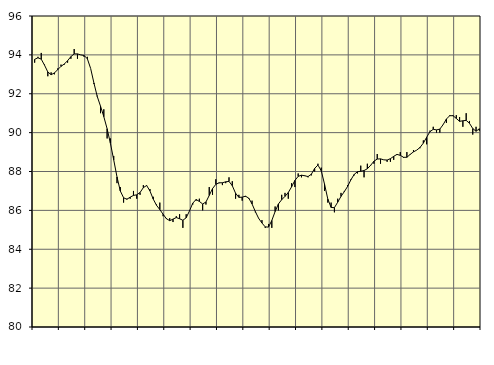
| Category | Piggar | Series 1 |
|---|---|---|
| nan | 93.6 | 93.77 |
| 87.0 | 93.9 | 93.85 |
| 87.0 | 94.1 | 93.78 |
| 87.0 | 93.5 | 93.47 |
| nan | 92.9 | 93.12 |
| 88.0 | 93.1 | 92.98 |
| 88.0 | 93 | 93.07 |
| 88.0 | 93.3 | 93.24 |
| nan | 93.5 | 93.41 |
| 89.0 | 93.5 | 93.53 |
| 89.0 | 93.6 | 93.7 |
| 89.0 | 93.8 | 93.91 |
| nan | 94.3 | 94.05 |
| 90.0 | 93.8 | 94.05 |
| 90.0 | 94 | 94 |
| 90.0 | 93.9 | 93.97 |
| nan | 93.9 | 93.8 |
| 91.0 | 93.3 | 93.3 |
| 91.0 | 92.5 | 92.55 |
| 91.0 | 91.9 | 91.86 |
| nan | 91 | 91.36 |
| 92.0 | 91.2 | 90.82 |
| 92.0 | 89.7 | 90.2 |
| 92.0 | 89.7 | 89.45 |
| nan | 88.8 | 88.6 |
| 93.0 | 87.4 | 87.72 |
| 93.0 | 87.2 | 87 |
| 93.0 | 86.4 | 86.65 |
| nan | 86.6 | 86.57 |
| 94.0 | 86.6 | 86.68 |
| 94.0 | 87 | 86.77 |
| 94.0 | 86.6 | 86.8 |
| nan | 86.8 | 86.92 |
| 95.0 | 87.3 | 87.17 |
| 95.0 | 87.3 | 87.28 |
| 95.0 | 87.1 | 87 |
| nan | 86.7 | 86.58 |
| 96.0 | 86.3 | 86.26 |
| 96.0 | 86.4 | 86.04 |
| 96.0 | 85.7 | 85.8 |
| nan | 85.6 | 85.57 |
| 97.0 | 85.6 | 85.47 |
| 97.0 | 85.4 | 85.55 |
| 97.0 | 85.7 | 85.63 |
| nan | 85.8 | 85.57 |
| 98.0 | 85.1 | 85.49 |
| 98.0 | 85.8 | 85.62 |
| 98.0 | 86 | 85.97 |
| nan | 86.3 | 86.37 |
| 99.0 | 86.5 | 86.56 |
| 99.0 | 86.6 | 86.46 |
| 99.0 | 86 | 86.33 |
| nan | 86.3 | 86.43 |
| 0.0 | 87.2 | 86.77 |
| 0.0 | 86.8 | 87.12 |
| 0.0 | 87.6 | 87.34 |
| nan | 87.4 | 87.42 |
| 1.0 | 87.3 | 87.42 |
| 1.0 | 87.4 | 87.47 |
| 1.0 | 87.7 | 87.49 |
| nan | 87.5 | 87.27 |
| 2.0 | 86.6 | 86.88 |
| 2.0 | 86.8 | 86.67 |
| 2.0 | 86.5 | 86.68 |
| nan | 86.7 | 86.73 |
| 3.0 | 86.6 | 86.63 |
| 3.0 | 86.5 | 86.33 |
| 3.0 | 85.9 | 85.94 |
| nan | 85.6 | 85.59 |
| 4.0 | 85.5 | 85.35 |
| 4.0 | 85.1 | 85.15 |
| 4.0 | 85.3 | 85.14 |
| nan | 85.1 | 85.48 |
| 5.0 | 86.2 | 85.94 |
| 5.0 | 86 | 86.33 |
| 5.0 | 86.8 | 86.55 |
| nan | 86.9 | 86.72 |
| 6.0 | 86.6 | 86.92 |
| 6.0 | 87.4 | 87.21 |
| 6.0 | 87.2 | 87.54 |
| nan | 87.9 | 87.75 |
| 7.0 | 87.7 | 87.81 |
| 7.0 | 87.8 | 87.78 |
| 7.0 | 87.7 | 87.74 |
| nan | 87.8 | 87.86 |
| 8.0 | 88 | 88.16 |
| 8.0 | 88.4 | 88.33 |
| 8.0 | 88.2 | 88.04 |
| nan | 87 | 87.35 |
| 9.0 | 86.4 | 86.58 |
| 9.0 | 86.4 | 86.15 |
| 9.0 | 85.9 | 86.14 |
| nan | 86.6 | 86.42 |
| 10.0 | 86.9 | 86.72 |
| 10.0 | 87 | 86.96 |
| 10.0 | 87.3 | 87.23 |
| nan | 87.6 | 87.57 |
| 11.0 | 87.8 | 87.85 |
| 11.0 | 87.9 | 87.99 |
| 11.0 | 88.3 | 88.01 |
| nan | 87.7 | 88.05 |
| 12.0 | 88.4 | 88.14 |
| 12.0 | 88.3 | 88.32 |
| 12.0 | 88.4 | 88.53 |
| nan | 88.9 | 88.64 |
| 13.0 | 88.4 | 88.65 |
| 13.0 | 88.6 | 88.6 |
| 13.0 | 88.5 | 88.59 |
| nan | 88.5 | 88.66 |
| 14.0 | 88.6 | 88.78 |
| 14.0 | 88.9 | 88.88 |
| 14.0 | 89 | 88.83 |
| nan | 88.7 | 88.73 |
| 15.0 | 89 | 88.73 |
| 15.0 | 88.9 | 88.88 |
| 15.0 | 89.1 | 89.01 |
| nan | 89.1 | 89.1 |
| 16.0 | 89.2 | 89.24 |
| 16.0 | 89.6 | 89.46 |
| 16.0 | 89.4 | 89.76 |
| nan | 90.1 | 90.05 |
| 17.0 | 90.3 | 90.17 |
| 17.0 | 90 | 90.14 |
| 17.0 | 90 | 90.18 |
| nan | 90.4 | 90.41 |
| 18.0 | 90.5 | 90.7 |
| 18.0 | 90.9 | 90.87 |
| 18.0 | 90.9 | 90.87 |
| nan | 90.9 | 90.73 |
| 19.0 | 90.8 | 90.58 |
| 19.0 | 90.3 | 90.61 |
| 19.0 | 91 | 90.63 |
| nan | 90.6 | 90.48 |
| 20.0 | 89.9 | 90.21 |
| 20.0 | 90.3 | 90.07 |
| 20.0 | 90.1 | 90.2 |